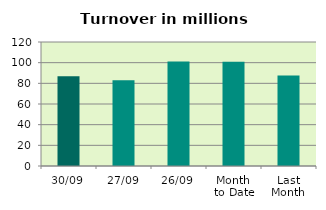
| Category | Series 0 |
|---|---|
| 30/09 | 86.744 |
| 27/09 | 82.987 |
| 26/09 | 101.235 |
| Month 
to Date | 100.935 |
| Last
Month | 87.619 |